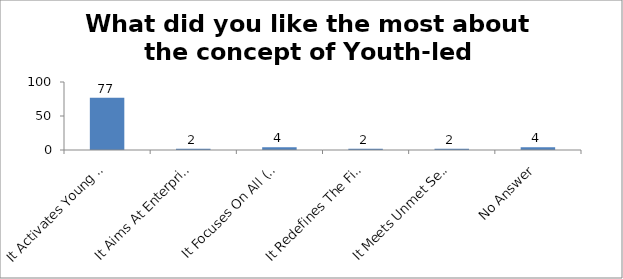
| Category | What did you like the most about the concept of Youth-led Changemaking? |
|---|---|
| It Activates Young People As Changemakers | 77 |
| It Aims At Enterprising Education | 2 |
| It Focuses On All (Troubled And Prepared) Young People | 4 |
| It Redefines The Field Of Youth Development | 2 |
| It Meets Unmet Service Needs Of The Society | 2 |
| No Answer | 4 |